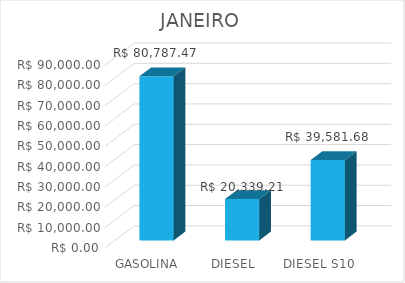
| Category | JANEIRO |
|---|---|
| GASOLINA | 80787.465 |
| DIESEL | 20339.208 |
| DIESEL S10 | 39581.675 |